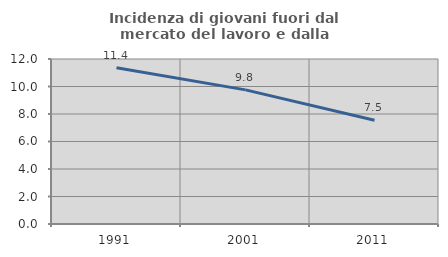
| Category | Incidenza di giovani fuori dal mercato del lavoro e dalla formazione  |
|---|---|
| 1991.0 | 11.364 |
| 2001.0 | 9.756 |
| 2011.0 | 7.547 |